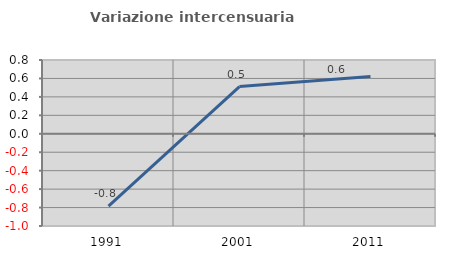
| Category | Variazione intercensuaria annua |
|---|---|
| 1991.0 | -0.784 |
| 2001.0 | 0.511 |
| 2011.0 | 0.62 |